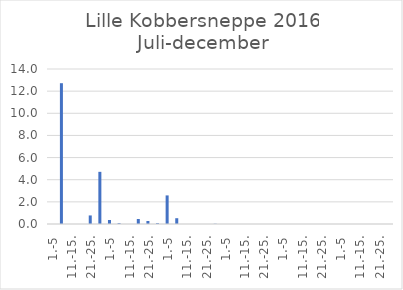
| Category | Series 0 |
|---|---|
| 1.-5 | 0 |
| 6.-10. | 12.717 |
| 11.-15. | 0 |
| 16.-20. | 0 |
| 21.-25. | 0.774 |
| 26.-31. | 4.712 |
| 1.-5 | 0.364 |
| 6.-10. | 0.074 |
| 11.-15. | 0 |
| 16.-20. | 0.45 |
| 21.-25. | 0.27 |
| 26.-31. | 0.074 |
| 1.-5 | 2.582 |
| 6.-10. | 0.523 |
| 11.-15. | 0 |
| 16.-20. | 0 |
| 21.-25. | 0 |
| 26.-30. | 0.022 |
| 1.-5 | 0 |
| 6.-10. | 0 |
| 11.-15. | 0 |
| 16.-20. | 0 |
| 21.-25. | 0 |
| 26.-31. | 0 |
| 1.-5 | 0 |
| 6.-10. | 0 |
| 11.-15. | 0 |
| 16.-20. | 0 |
| 21.-25. | 0 |
| 26.-30. | 0 |
| 1.-5 | 0 |
| 6.-10. | 0 |
| 11.-15. | 0 |
| 16.-20. | 0 |
| 21.-25. | 0 |
| 26.-31. | 0 |